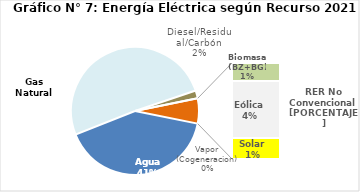
| Category | Series 0 |
|---|---|
| Agua | 1979.272 |
| Gas Natural | 2466.14 |
| Diesel/Residual/Carbón | 96.783 |
| Vapor (Cogeneracion) | 0.253 |
| Biomasa (BZ+BG) | 58.09 |
| Eólica | 182.616 |
| Solar | 67.536 |